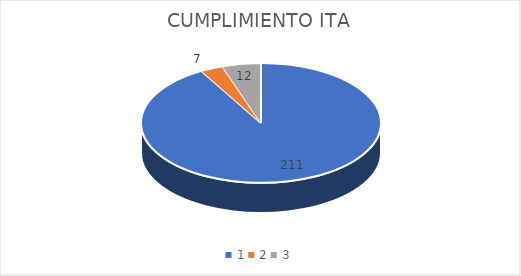
| Category | Series 0 |
|---|---|
| 0 | 211 |
| 1 | 7 |
| 2 | 12 |